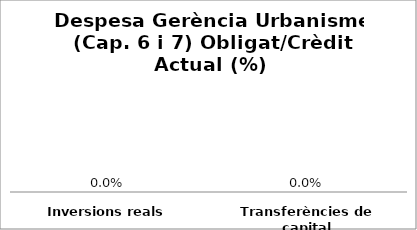
| Category | Series 0 |
|---|---|
| Inversions reals | 0 |
| Transferències de capital | 0 |